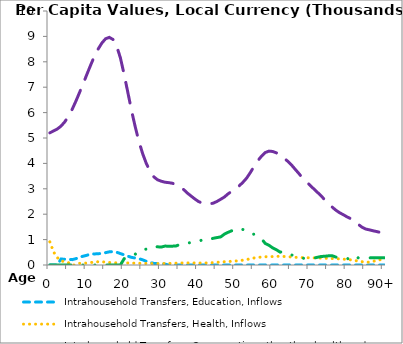
| Category | Intrahousehold Transfers, Education, Inflows | Intrahousehold Transfers, Health, Inflows | Intrahousehold Transfers, Consumption other than health and education, Inflows | Intrahousehold Transfers, Saving, Inflows |
|---|---|---|---|---|
| 0 | 0 | 910.909 | 5203.205 | 0 |
|  | 0 | 515.69 | 5277.693 | 0 |
| 2 | 0 | 291.947 | 5353.787 | 0 |
| 3 | 234.245 | 174.462 | 5466.992 | 0 |
| 4 | 228.039 | 120.422 | 5632.816 | 0 |
| 5 | 221.998 | 90.266 | 5850.025 | 0 |
| 6 | 211.058 | 0 | 6125.525 | 0 |
| 7 | 248.649 | 0 | 6448.028 | 0 |
| 8 | 309.716 | 64.477 | 6794.27 | 0 |
| 9 | 347.436 | 69.767 | 7148.635 | 0 |
| 10 | 384.358 | 76.741 | 7516.295 | 0 |
| 11 | 436.737 | 97.138 | 7877.053 | 0 |
| 12 | 435.425 | 118.894 | 8219.02 | 0 |
| 13 | 443.85 | 127.519 | 8502.166 | 0 |
| 14 | 456.469 | 125.388 | 8737.596 | 0 |
| 15 | 485.717 | 115.083 | 8907.133 | 0 |
| 16 | 518.407 | 98.958 | 8961.677 | 0 |
| 17 | 526.273 | 88.512 | 8879.919 | 0 |
| 18 | 503.091 | 86.075 | 8615.804 | 0 |
| 19 | 448.999 | 83.585 | 8150.452 | 0 |
| 20 | 398.538 | 80.576 | 7500.072 | 248.037 |
| 21 | 348.842 | 79.652 | 6792.372 | 294.879 |
| 22 | 300.305 | 75.965 | 6074.008 | 350.566 |
| 23 | 273.696 | 71.876 | 5431.378 | 425.475 |
| 24 | 247.162 | 67.079 | 4853.653 | 567.451 |
| 25 | 203.029 | 63.831 | 4376.749 | 602.089 |
| 26 | 141.962 | 60.36 | 3984.22 | 627.262 |
| 27 | 95.224 | 58.388 | 3690.698 | 725.928 |
| 28 | 64.621 | 55.644 | 3469.235 | 726.879 |
| 29 | 51.555 | 55.721 | 3354.517 | 715.823 |
| 30 | 42.24 | 57.157 | 3298.514 | 706.884 |
| 31 | 34.607 | 59.209 | 3259.272 | 743.994 |
| 32 | 0 | 62.316 | 3242.134 | 741.315 |
| 33 | 0 | 67.711 | 3217.651 | 741.281 |
| 34 | 0 | 72.678 | 3165.164 | 750.974 |
| 35 | 0 | 77.166 | 3075.837 | 811.049 |
| 36 | 0 | 80.78 | 2973.428 | 811.489 |
| 37 | 0 | 82.539 | 2833.687 | 868.293 |
| 38 | 0 | 82.026 | 2717.55 | 879.797 |
| 39 | 0 | 80.911 | 2603.457 | 928.028 |
| 40 | 0 | 78.406 | 2500.711 | 927.544 |
| 41 | 0 | 78.58 | 2437.803 | 987.267 |
| 42 | 0 | 80.537 | 2421.742 | 953.111 |
| 43 | 0 | 86.553 | 2409.211 | 1011.995 |
| 44 | 0 | 94.457 | 2434.538 | 1052.433 |
| 45 | 0 | 106.012 | 2503.305 | 1080.075 |
| 46 | 0 | 118.305 | 2588.284 | 1106.708 |
| 47 | 0 | 129.945 | 2677.669 | 1216.353 |
| 48 | 0 | 137.614 | 2803.504 | 1287.57 |
| 49 | 0 | 146.824 | 2902.668 | 1350.551 |
| 50 | 0 | 157.105 | 3004.6 | 1434.798 |
| 51 | 0 | 171.844 | 3118.793 | 1439.344 |
| 52 | 0 | 191.018 | 3260.036 | 1395.795 |
| 53 | 0 | 217.873 | 3424.203 | 1350.051 |
| 54 | 0 | 247.579 | 3646.423 | 1234.677 |
| 55 | 0 | 279.104 | 3881.642 | 1208.934 |
| 56 | 0 | 298.302 | 4110.869 | 1099.371 |
| 57 | 0 | 312.96 | 4286.35 | 1025.445 |
| 58 | 0 | 323.64 | 4428.216 | 846.939 |
| 59 | 0 | 329.301 | 4484.27 | 775.319 |
| 60 | 0 | 331.834 | 4468.707 | 672.898 |
| 61 | 0 | 340.122 | 4414.72 | 600.431 |
| 62 | 0 | 341.712 | 4320.705 | 505.998 |
| 63 | 0 | 335.99 | 4212.927 | 531.81 |
| 64 | 0 | 327.376 | 4088.642 | 466.899 |
| 65 | 0 | 315.522 | 3948.581 | 398.544 |
| 66 | 0 | 302.763 | 3776.533 | 355.752 |
| 67 | 0 | 294.744 | 3609.244 | 317.227 |
| 68 | 0 | 290.393 | 3431.348 | 268.099 |
| 69 | 0 | 287.478 | 3294.669 | 256.794 |
| 70 | 0 | 284.582 | 3142.048 | 260.347 |
| 71 | 0 | 281.004 | 3004.943 | 263.475 |
| 72 | 0 | 277.616 | 2866.131 | 303.275 |
| 73 | 0 | 273.161 | 2728.936 | 333.76 |
| 74 | 0 | 265.857 | 2566.742 | 345.157 |
| 75 | 0 | 259.974 | 2422.704 | 360.177 |
| 76 | 0 | 254.729 | 2281.329 | 365.976 |
| 77 | 0 | 248.792 | 2158.203 | 311.429 |
| 78 | 0 | 239.856 | 2058.066 | 281.075 |
| 79 | 0 | 229.982 | 1981.007 | 290.851 |
| 80 | 0 | 218.234 | 1894.73 | 267.385 |
| 81 | 0 | 202.12 | 1823.229 | 193.71 |
| 82 | 0 | 182.637 | 1768.639 | 153.806 |
| 83 | 0 | 154.489 | 1604.508 | 283.724 |
| 84 | 0 | 131.114 | 1492.806 | 283.724 |
| 85 | 0 | 109.324 | 1417.127 | 283.724 |
| 86 | 0 | 113.82 | 1384.913 | 283.724 |
| 87 | 0 | 145.154 | 1347.851 | 283.724 |
| 88 | 0 | 174.269 | 1316.56 | 283.724 |
| 89 | 0 | 209.225 | 1281.305 | 283.724 |
| 90+ | 0 | 209.225 | 1243.486 | 283.724 |